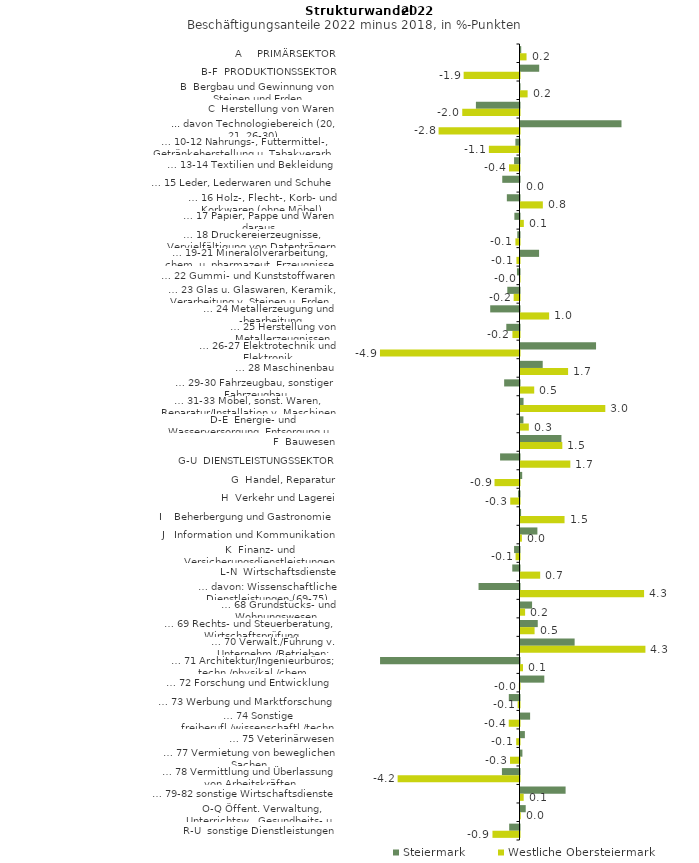
| Category | Steiermark | Westliche Obersteiermark |
|---|---|---|
| A     PRIMÄRSEKTOR | 0.025 | 0.21 |
| B-F  PRODUKTIONSSEKTOR | 0.65 | -1.943 |
| B  Bergbau und Gewinnung von Steinen und Erden | -0.011 | 0.247 |
| C  Herstellung von Waren | -1.516 | -1.991 |
| ... davon Technologiebereich (20, 21, 26-30) | 3.513 | -2.814 |
| … 10-12 Nahrungs-, Futtermittel-, Getränkeherstellung u. Tabakverarb. | -0.143 | -1.065 |
| … 13-14 Textilien und Bekleidung | -0.189 | -0.366 |
| … 15 Leder, Lederwaren und Schuhe | -0.6 | 0 |
| … 16 Holz-, Flecht-, Korb- und Korkwaren (ohne Möbel)  | -0.44 | 0.777 |
| … 17 Papier, Pappe und Waren daraus  | -0.178 | 0.116 |
| … 18 Druckereierzeugnisse, Vervielfältigung von Datenträgern | -0.077 | -0.142 |
| … 19-21 Mineralölverarbeitung, chem. u. pharmazeut. Erzeugnisse | 0.646 | -0.106 |
| … 22 Gummi- und Kunststoffwaren | -0.089 | -0.002 |
| … 23 Glas u. Glaswaren, Keramik, Verarbeitung v. Steinen u. Erden  | -0.424 | -0.203 |
| … 24 Metallerzeugung und -bearbeitung | -1.019 | 0.995 |
| … 25 Herstellung von Metallerzeugnissen  | -0.459 | -0.246 |
| … 26-27 Elektrotechnik und Elektronik | 2.628 | -4.854 |
| … 28 Maschinenbau | 0.773 | 1.655 |
| … 29-30 Fahrzeugbau, sonstiger Fahrzeugbau | -0.534 | 0.477 |
| … 31-33 Möbel, sonst. Waren, Reparatur/Installation v. Maschinen | 0.106 | 2.95 |
| D-E  Energie- und Wasserversorgung, Entsorgung u. Rückgewinnung | 0.102 | 0.289 |
| F  Bauwesen | 1.424 | 1.455 |
| G-U  DIENSTLEISTUNGSSEKTOR | -0.676 | 1.733 |
| G  Handel, Reparatur | 0.059 | -0.869 |
| H  Verkehr und Lagerei | -0.05 | -0.322 |
| I    Beherbergung und Gastronomie | 0.02 | 1.532 |
| J   Information und Kommunikation | 0.588 | 0.048 |
| K  Finanz- und Versicherungsdienstleistungen | -0.188 | -0.136 |
| L-N  Wirtschaftsdienste | -0.252 | 0.684 |
| … davon: Wissenschaftliche Dienstleistungen (69-75) | -1.425 | 4.298 |
| … 68 Grundstücks- und Wohnungswesen  | 0.402 | 0.16 |
| … 69 Rechts- und Steuerberatung, Wirtschaftsprüfung | 0.6 | 0.49 |
| … 70 Verwalt./Führung v. Unternehm./Betrieben; Unternehmensberat. | 1.883 | 4.345 |
| … 71 Architektur/Ingenieurbüros; techn./physikal./chem. Untersuchung | -4.85 | 0.088 |
| … 72 Forschung und Entwicklung  | 0.828 | -0.021 |
| … 73 Werbung und Marktforschung | -0.372 | -0.064 |
| … 74 Sonstige freiberufl./wissenschaftl./techn. Tätigkeiten | 0.334 | -0.374 |
| … 75 Veterinärwesen | 0.152 | -0.114 |
| … 77 Vermietung von beweglichen Sachen  | 0.067 | -0.331 |
| … 78 Vermittlung und Überlassung von Arbeitskräften | -0.611 | -4.239 |
| … 79-82 sonstige Wirtschaftsdienste | 1.569 | 0.111 |
| O-Q Öffent. Verwaltung, Unterrichtsw., Gesundheits- u. Sozialwesen | 0.182 | 0.009 |
| R-U  sonstige Dienstleistungen | -0.359 | -0.941 |